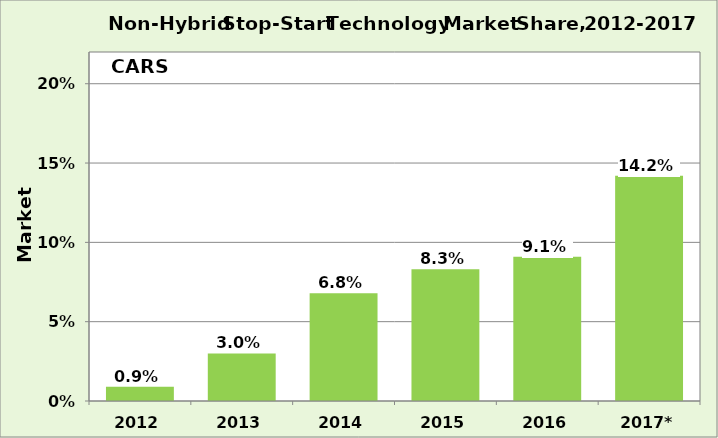
| Category | Series 0 |
|---|---|
| 2012 | 0.009 |
| 2013 | 0.03 |
| 2014 | 0.068 |
| 2015 | 0.083 |
| 2016 | 0.091 |
| 2017* | 0.142 |